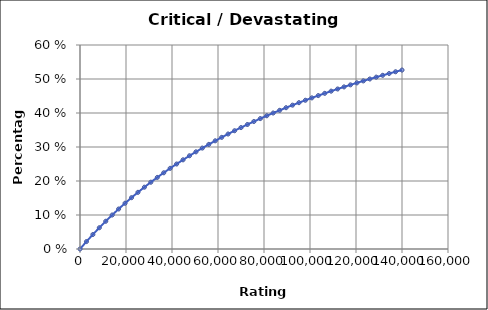
| Category | Critical / Devastating Magnitude |
|---|---|
| 0.0 | 0 |
| 2800.0 | 0.022 |
| 5600.0 | 0.043 |
| 8400.0 | 0.062 |
| 11200.0 | 0.082 |
| 14000.0 | 0.1 |
| 16800.0 | 0.118 |
| 19600.0 | 0.135 |
| 22400.0 | 0.151 |
| 25200.0 | 0.167 |
| 28000.0 | 0.182 |
| 30800.0 | 0.196 |
| 33600.0 | 0.211 |
| 36400.0 | 0.224 |
| 39200.0 | 0.237 |
| 42000.0 | 0.25 |
| 44800.0 | 0.262 |
| 47600.0 | 0.274 |
| 50400.0 | 0.286 |
| 53200.0 | 0.297 |
| 56000.0 | 0.308 |
| 58800.0 | 0.318 |
| 61600.0 | 0.328 |
| 64400.0 | 0.338 |
| 67200.0 | 0.348 |
| 70000.0 | 0.357 |
| 72800.0 | 0.366 |
| 75600.0 | 0.375 |
| 78400.0 | 0.384 |
| 81200.0 | 0.392 |
| 84000.0 | 0.4 |
| 86800.0 | 0.408 |
| 89600.0 | 0.416 |
| 92400.0 | 0.423 |
| 95200.0 | 0.43 |
| 98000.0 | 0.438 |
| 100800.0 | 0.444 |
| 103600.0 | 0.451 |
| 106400.0 | 0.458 |
| 109200.0 | 0.464 |
| 112000.0 | 0.471 |
| 114800.0 | 0.477 |
| 117600.0 | 0.483 |
| 120400.0 | 0.489 |
| 123200.0 | 0.494 |
| 126000.0 | 0.5 |
| 128800.0 | 0.505 |
| 131600.0 | 0.511 |
| 134400.0 | 0.516 |
| 137200.0 | 0.521 |
| 140000.0 | 0.526 |